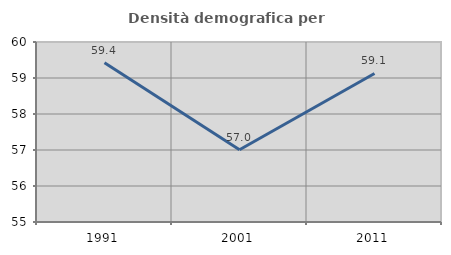
| Category | Densità demografica |
|---|---|
| 1991.0 | 59.422 |
| 2001.0 | 57.008 |
| 2011.0 | 59.126 |